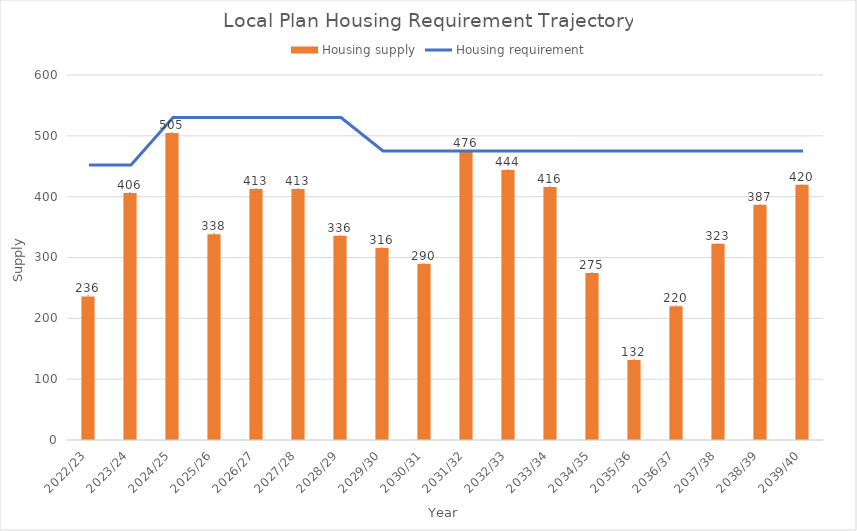
| Category | Housing supply |
|---|---|
| 2022/23 | 236 |
| 2023/24 | 406 |
| 2024/25 | 504.8 |
| 2025/26 | 338.1 |
| 2026/27 | 412.5 |
| 2027/28 | 412.7 |
| 2028/29 | 335.7 |
| 2029/30 | 315.7 |
| 2030/31 | 289.7 |
| 2031/32 | 475.7 |
| 2032/33 | 443.7 |
| 2033/34 | 415.7 |
| 2034/35 | 274.7 |
| 2035/36 | 131.7 |
| 2036/37 | 219.7 |
| 2037/38 | 322.7 |
| 2038/39 | 386.7 |
| 2039/40 | 419.7 |